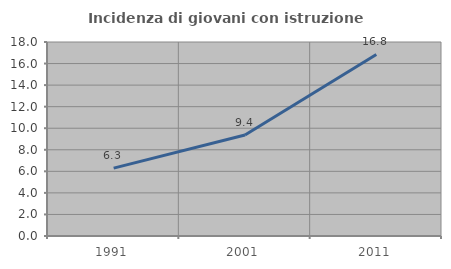
| Category | Incidenza di giovani con istruzione universitaria |
|---|---|
| 1991.0 | 6.299 |
| 2001.0 | 9.367 |
| 2011.0 | 16.849 |